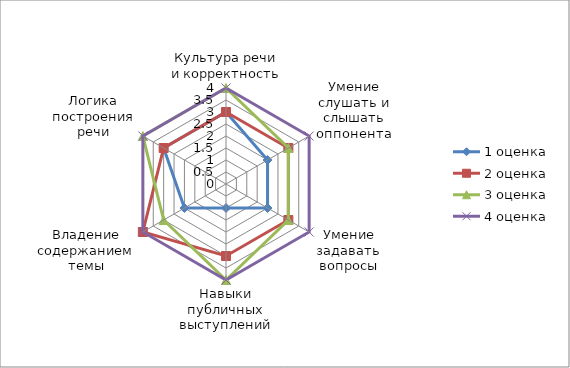
| Category | 1 оценка  | 2 оценка | 3 оценка | 4 оценка |
|---|---|---|---|---|
| Культура речи и корректность | 3 | 3 | 4 | 4 |
| Умение слушать и слышать оппонента | 2 | 3 | 3 | 4 |
| Умение задавать вопросы | 2 | 3 | 3 | 4 |
| Навыки публичных выступлений | 1 | 3 | 4 | 4 |
| Владение содержанием темы | 2 | 4 | 3 | 4 |
| Логика построения речи | 3 | 3 | 4 | 4 |